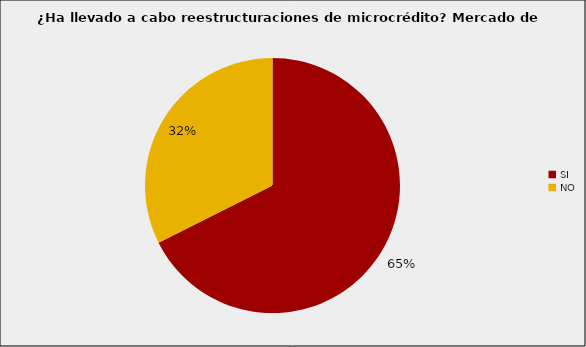
| Category | Mercado de Microcrédito |
|---|---|
| SI | 0.676 |
| NO | 0.324 |